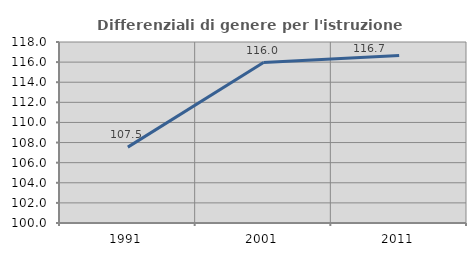
| Category | Differenziali di genere per l'istruzione superiore |
|---|---|
| 1991.0 | 107.545 |
| 2001.0 | 115.955 |
| 2011.0 | 116.669 |